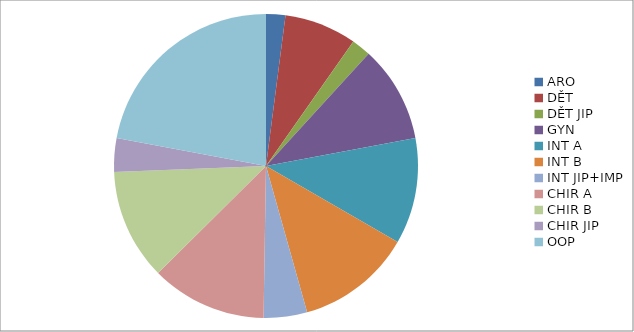
| Category | Series 0 | Series 1 | Series 2 | Series 3 | Series 4 | Series 5 | Series 6 | Series 7 |
|---|---|---|---|---|---|---|---|---|
| ARO | 4 | 43 | 43 | 5 | 0.116 | 0.116 | 2 | 0.047 |
| DĚT | 15 | 0 | 0 | 0 | 0 | 0 | 0 | 0 |
| DĚT JIP | 4 | 0 | 0 | 0 | 0 | 0 | 0 | 0 |
| GYN | 20 | 105 | 0 | 0 | 0 | 0 | 0 | 0 |
| INT A | 22 | 262 | 109 | 15 | 0.057 | 0.138 | 0 | 0 |
| INT B | 24 | 250 | 121 | 14 | 0.056 | 0.116 | 0 | 0 |
| INT JIP+IMP | 9 | 99 | 35 | 6 | 0.061 | 0.171 | 0 | 0 |
| CHIR A | 24 | 217 | 27 | 3 | 0.014 | 0.111 | 0 | 0 |
| CHIR B | 23 | 147 | 47 | 10 | 0.068 | 0.213 | 0 | 0 |
| CHIR JIP | 7 | 71 | 64 | 6 | 0.085 | 0.094 | 1 | 0.014 |
| OOP | 43 | 424 | 203 | 55 | 0.13 | 0.271 | 40 | 0.094 |